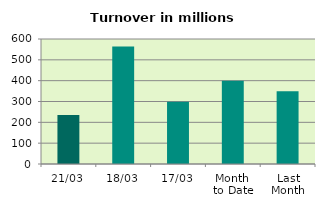
| Category | Series 0 |
|---|---|
| 21/03 | 235.502 |
| 18/03 | 564.159 |
| 17/03 | 299.298 |
| Month 
to Date | 399.392 |
| Last
Month | 349.641 |